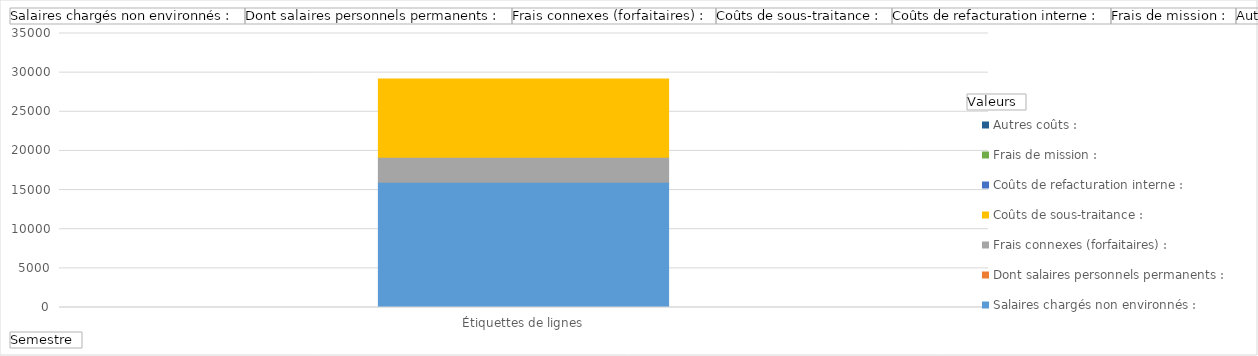
| Category | Salaires chargés non environnés : | Dont salaires personnels permanents : | Frais connexes (forfaitaires) : | Coûts de sous-traitance : | Coûts de refacturation interne : | Frais de mission : | Autres coûts : |
|---|---|---|---|---|---|---|---|
| SEM01 | 16000 |  | 3200 | 10000 | 0 | 0 | 0 |
| SEM02 | 16000 |  | 3200 | 0 | 0 | 0 | 100000 |
| (vide) | 0 |  | 0 | 0 | 0 | 0 | 0 |